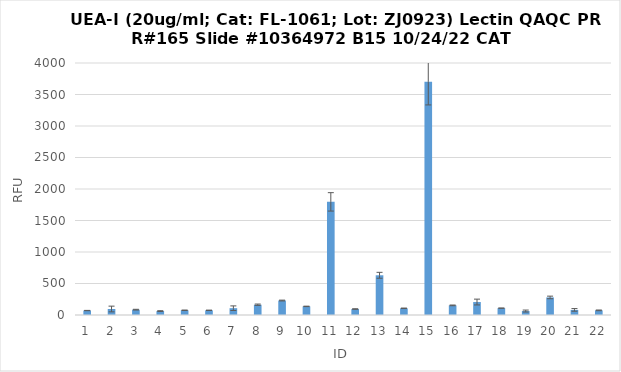
| Category | RFU |
|---|---|
| 0 | 70.75 |
| 1 | 95.25 |
| 2 | 84.5 |
| 3 | 62.25 |
| 4 | 75.25 |
| 5 | 74.5 |
| 6 | 108 |
| 7 | 163.25 |
| 8 | 229.75 |
| 9 | 136.75 |
| 10 | 1795.75 |
| 11 | 94.75 |
| 12 | 630.5 |
| 13 | 106.25 |
| 14 | 3700.75 |
| 15 | 152.75 |
| 16 | 205.75 |
| 17 | 108.75 |
| 18 | 62.75 |
| 19 | 278.75 |
| 20 | 81 |
| 21 | 73.75 |